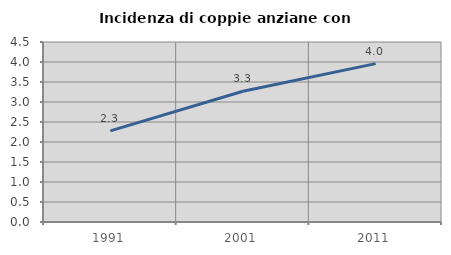
| Category | Incidenza di coppie anziane con figli |
|---|---|
| 1991.0 | 2.278 |
| 2001.0 | 3.269 |
| 2011.0 | 3.96 |